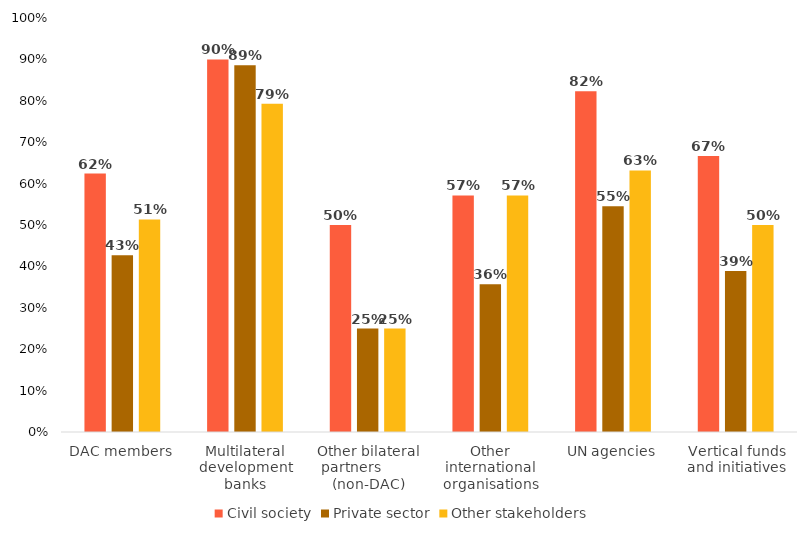
| Category | Civil society | Private sector | Other stakeholders |
|---|---|---|---|
| DAC members | 0.624 | 0.427 | 0.514 |
| Multilateral development banks | 0.9 | 0.886 | 0.793 |
| Other bilateral partners         (non-DAC) | 0.5 | 0.25 | 0.25 |
| Other international organisations | 0.571 | 0.357 | 0.571 |
| UN agencies | 0.823 | 0.545 | 0.632 |
| Vertical funds and initiatives | 0.667 | 0.389 | 0.5 |